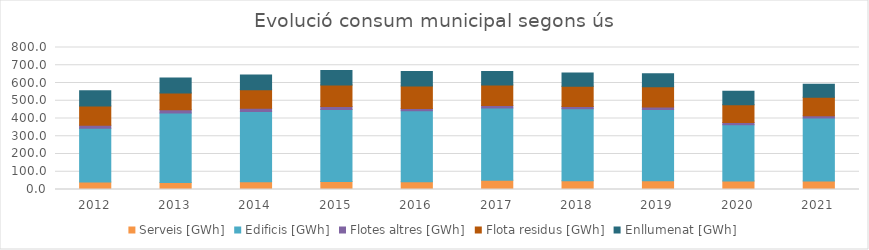
| Category | Serveis [GWh] | Edificis [GWh] | Flotes altres [GWh] | Flota residus [GWh] | Enllumenat [GWh] |
|---|---|---|---|---|---|
| 2012.0 | 42.956 | 302.559 | 16.79 | 108.485 | 86.21 |
| 2013.0 | 40.124 | 390.223 | 18.985 | 94.689 | 84.773 |
| 2014.0 | 44.105 | 395.481 | 18.009 | 104.38 | 83.169 |
| 2015.0 | 44.794 | 406.486 | 16.577 | 120.722 | 81.538 |
| 2016.0 | 44.104 | 398.929 | 13.673 | 125.924 | 81.508 |
| 2017.0 | 52.199 | 406.64 | 14.187 | 116.238 | 75.621 |
| 2018.0 | 48.911 | 405.459 | 13.336 | 113.598 | 74.676 |
| 2019.0 | 48.964 | 402.316 | 13.014 | 114.845 | 72.756 |
| 2020.0 | 47.595 | 317.785 | 11.603 | 99.897 | 76.606 |
| 2021.0 | 47.456 | 355.304 | 12.232 | 104.987 | 73.345 |